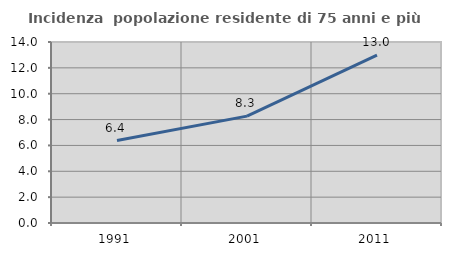
| Category | Incidenza  popolazione residente di 75 anni e più |
|---|---|
| 1991.0 | 6.379 |
| 2001.0 | 8.267 |
| 2011.0 | 12.988 |